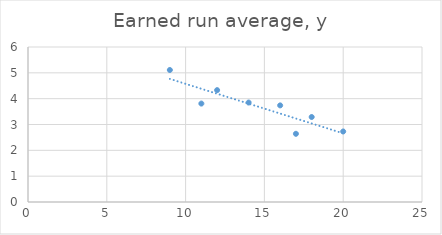
| Category | Earned run average, y |
|---|---|
| 20.0 | 2.73 |
| 18.0 | 3.29 |
| 17.0 | 2.64 |
| 16.0 | 3.74 |
| 14.0 | 3.85 |
| 12.0 | 4.33 |
| 11.0 | 3.81 |
| 9.0 | 5.11 |